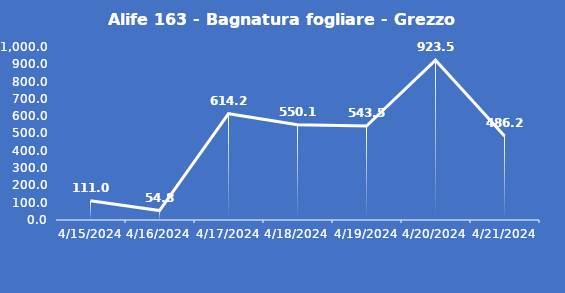
| Category | Alife 163 - Bagnatura fogliare - Grezzo (min) |
|---|---|
| 4/15/24 | 111 |
| 4/16/24 | 54.8 |
| 4/17/24 | 614.2 |
| 4/18/24 | 550.1 |
| 4/19/24 | 543.5 |
| 4/20/24 | 923.5 |
| 4/21/24 | 486.2 |